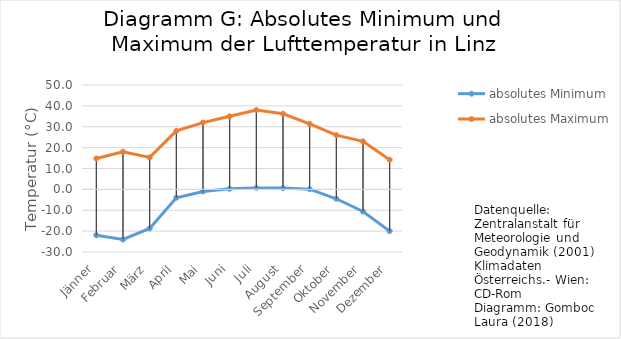
| Category | absolutes Minimum | absolutes Maximum |
|---|---|---|
| Jänner | -22 | 14.8 |
| Februar | -24 | 18 |
| März | -18.7 | 15.3 |
| April | -4 | 28 |
| Mai | -1 | 32 |
| Juni | 0.3 | 35 |
| Juli | 0.7 | 38 |
| August | 0.6 | 36.2 |
| September | 0.1 | 31.4 |
| Oktober | -4.5 | 26 |
| November | -10.6 | 23 |
| Dezember | -20 | 14.2 |